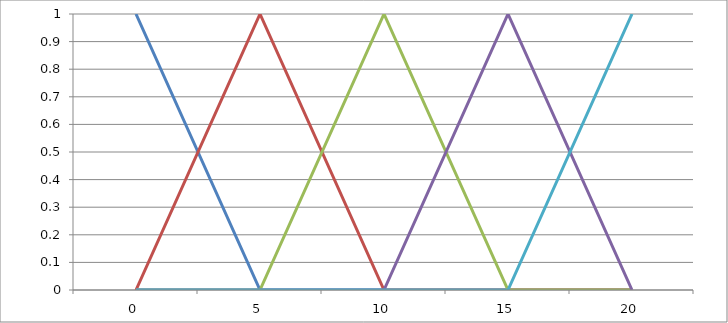
| Category | 0 | 5 | 10 | 15 | 20 |
|---|---|---|---|---|---|
| 0.0 | 1 | 0 | 0 | 0 | 0 |
| 5.0 | 0 | 1 | 0 | 0 | 0 |
| 10.0 | 0 | 0 | 1 | 0 | 0 |
| 15.0 | 0 | 0 | 0 | 1 | 0 |
| 20.0 | 0 | 0 | 0 | 0 | 1 |